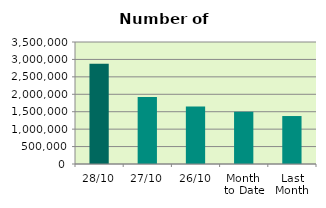
| Category | Series 0 |
|---|---|
| 28/10 | 2878802 |
| 27/10 | 1922040 |
| 26/10 | 1647828 |
| Month 
to Date | 1496809 |
| Last
Month | 1376245.636 |